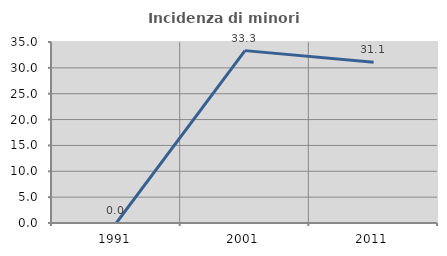
| Category | Incidenza di minori stranieri |
|---|---|
| 1991.0 | 0 |
| 2001.0 | 33.333 |
| 2011.0 | 31.076 |